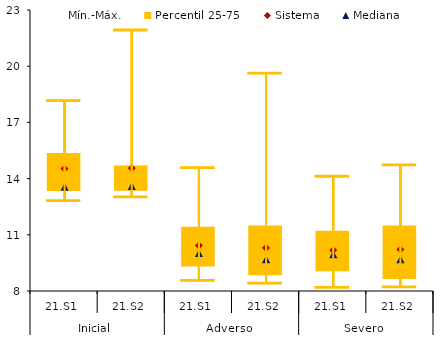
| Category | Mediana | P25 | Mínimo | Linea | Mín.-Máx. | Percentil 25-75 | Max |
|---|---|---|---|---|---|---|---|
| 0 | 0.173 | 0.588 | 0 | 0.01 | 12.793 | 1.809 | 2.755 |
| 1 | 0.2 | 0.4 | 0 | 0.01 | 12.99 | 1.1 | 7.2 |
| 2 | 0.664 | 0.817 | 0 | 0.01 | 8.533 | 1.402 | 3.129 |
| 3 | 0.8 | 0.5 | 0 | 0.01 | 8.39 | 1.8 | 8.1 |
| 4 | 0.851 | 0.935 | 0 | 0.01 | 8.165 | 1.258 | 2.875 |
| 5 | 1 | 0.5 | 0 | 0.01 | 8.19 | 1.8 | 3.2 |